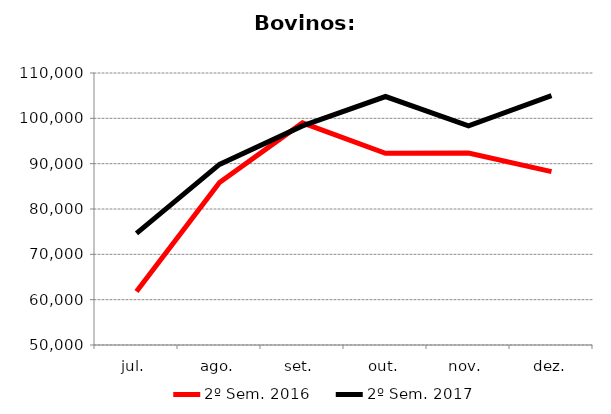
| Category | 2º Sem. 2016 | 2º Sem. 2017 |
|---|---|---|
| jul. | 61818 | 74609 |
| ago. | 85833 | 89832 |
| set. | 98990 | 98339 |
| out. | 92303 | 104811 |
| nov. | 92346 | 98318 |
| dez. | 88244 | 105019 |